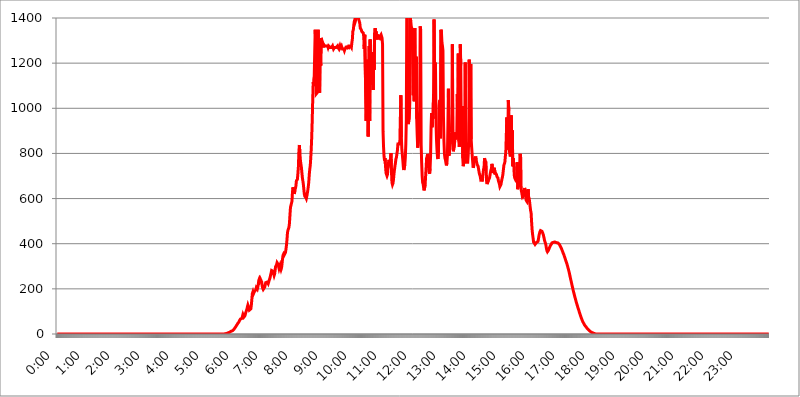
| Category | 2015.03.16. Intenzitás [W/m^2] |
|---|---|
| 0.0 | -0.256 |
| 0.0006944444444444445 | -0.256 |
| 0.001388888888888889 | -0.256 |
| 0.0020833333333333333 | -0.256 |
| 0.002777777777777778 | -0.256 |
| 0.003472222222222222 | -0.256 |
| 0.004166666666666667 | -0.256 |
| 0.004861111111111111 | -0.256 |
| 0.005555555555555556 | -0.256 |
| 0.0062499999999999995 | -0.256 |
| 0.006944444444444444 | -0.256 |
| 0.007638888888888889 | -0.256 |
| 0.008333333333333333 | -0.256 |
| 0.009027777777777779 | -0.256 |
| 0.009722222222222222 | -0.256 |
| 0.010416666666666666 | -0.256 |
| 0.011111111111111112 | -0.256 |
| 0.011805555555555555 | -0.256 |
| 0.012499999999999999 | -0.256 |
| 0.013194444444444444 | -0.256 |
| 0.013888888888888888 | -0.256 |
| 0.014583333333333332 | -0.256 |
| 0.015277777777777777 | -0.256 |
| 0.015972222222222224 | -0.256 |
| 0.016666666666666666 | -0.256 |
| 0.017361111111111112 | -0.256 |
| 0.018055555555555557 | -0.256 |
| 0.01875 | -0.256 |
| 0.019444444444444445 | -0.256 |
| 0.02013888888888889 | -0.256 |
| 0.020833333333333332 | -0.256 |
| 0.02152777777777778 | -0.256 |
| 0.022222222222222223 | -0.256 |
| 0.02291666666666667 | -0.256 |
| 0.02361111111111111 | -0.256 |
| 0.024305555555555556 | -0.256 |
| 0.024999999999999998 | -0.256 |
| 0.025694444444444447 | -0.256 |
| 0.02638888888888889 | -0.256 |
| 0.027083333333333334 | -0.256 |
| 0.027777777777777776 | -0.256 |
| 0.02847222222222222 | -0.256 |
| 0.029166666666666664 | -0.256 |
| 0.029861111111111113 | -0.256 |
| 0.030555555555555555 | -0.256 |
| 0.03125 | -0.256 |
| 0.03194444444444445 | -0.256 |
| 0.03263888888888889 | -0.256 |
| 0.03333333333333333 | -0.256 |
| 0.034027777777777775 | -0.256 |
| 0.034722222222222224 | -0.256 |
| 0.035416666666666666 | -0.256 |
| 0.036111111111111115 | -0.256 |
| 0.03680555555555556 | -0.256 |
| 0.0375 | -0.256 |
| 0.03819444444444444 | -0.256 |
| 0.03888888888888889 | -0.256 |
| 0.03958333333333333 | -0.256 |
| 0.04027777777777778 | -0.256 |
| 0.04097222222222222 | -0.256 |
| 0.041666666666666664 | -0.256 |
| 0.042361111111111106 | -0.256 |
| 0.04305555555555556 | -0.256 |
| 0.043750000000000004 | -0.256 |
| 0.044444444444444446 | -0.256 |
| 0.04513888888888889 | -0.256 |
| 0.04583333333333334 | -0.256 |
| 0.04652777777777778 | -0.256 |
| 0.04722222222222222 | -0.256 |
| 0.04791666666666666 | -0.256 |
| 0.04861111111111111 | -0.256 |
| 0.049305555555555554 | -0.256 |
| 0.049999999999999996 | -0.256 |
| 0.05069444444444445 | -0.256 |
| 0.051388888888888894 | -0.256 |
| 0.052083333333333336 | -0.256 |
| 0.05277777777777778 | -0.256 |
| 0.05347222222222222 | -0.256 |
| 0.05416666666666667 | -0.256 |
| 0.05486111111111111 | -0.256 |
| 0.05555555555555555 | -0.256 |
| 0.05625 | -0.256 |
| 0.05694444444444444 | -0.256 |
| 0.057638888888888885 | -0.256 |
| 0.05833333333333333 | -0.256 |
| 0.05902777777777778 | -0.256 |
| 0.059722222222222225 | -0.256 |
| 0.06041666666666667 | -0.256 |
| 0.061111111111111116 | -0.256 |
| 0.06180555555555556 | -0.256 |
| 0.0625 | -0.256 |
| 0.06319444444444444 | -0.256 |
| 0.06388888888888888 | -0.256 |
| 0.06458333333333334 | -0.256 |
| 0.06527777777777778 | -0.256 |
| 0.06597222222222222 | -0.256 |
| 0.06666666666666667 | -0.256 |
| 0.06736111111111111 | -0.256 |
| 0.06805555555555555 | -0.256 |
| 0.06874999999999999 | -0.256 |
| 0.06944444444444443 | -0.256 |
| 0.07013888888888889 | -0.256 |
| 0.07083333333333333 | -0.256 |
| 0.07152777777777779 | -0.256 |
| 0.07222222222222223 | -0.256 |
| 0.07291666666666667 | -0.256 |
| 0.07361111111111111 | -0.256 |
| 0.07430555555555556 | -0.256 |
| 0.075 | -0.256 |
| 0.07569444444444444 | -0.256 |
| 0.0763888888888889 | -0.256 |
| 0.07708333333333334 | -0.256 |
| 0.07777777777777778 | -0.256 |
| 0.07847222222222222 | -0.256 |
| 0.07916666666666666 | -0.256 |
| 0.0798611111111111 | -0.256 |
| 0.08055555555555556 | -0.256 |
| 0.08125 | -0.256 |
| 0.08194444444444444 | -0.256 |
| 0.08263888888888889 | -0.256 |
| 0.08333333333333333 | -0.256 |
| 0.08402777777777777 | -0.256 |
| 0.08472222222222221 | -0.256 |
| 0.08541666666666665 | -0.256 |
| 0.08611111111111112 | -0.256 |
| 0.08680555555555557 | -0.256 |
| 0.08750000000000001 | -0.256 |
| 0.08819444444444445 | -0.256 |
| 0.08888888888888889 | -0.256 |
| 0.08958333333333333 | -0.256 |
| 0.09027777777777778 | -0.256 |
| 0.09097222222222222 | -0.256 |
| 0.09166666666666667 | -0.256 |
| 0.09236111111111112 | -0.256 |
| 0.09305555555555556 | -0.256 |
| 0.09375 | -0.256 |
| 0.09444444444444444 | -0.256 |
| 0.09513888888888888 | -0.256 |
| 0.09583333333333333 | -0.256 |
| 0.09652777777777777 | -0.256 |
| 0.09722222222222222 | -0.256 |
| 0.09791666666666667 | -0.256 |
| 0.09861111111111111 | -0.256 |
| 0.09930555555555555 | -0.256 |
| 0.09999999999999999 | -0.256 |
| 0.10069444444444443 | -0.256 |
| 0.1013888888888889 | -0.256 |
| 0.10208333333333335 | -0.256 |
| 0.10277777777777779 | -0.256 |
| 0.10347222222222223 | -0.256 |
| 0.10416666666666667 | -0.256 |
| 0.10486111111111111 | -0.256 |
| 0.10555555555555556 | -0.256 |
| 0.10625 | -0.256 |
| 0.10694444444444444 | -0.256 |
| 0.1076388888888889 | -0.256 |
| 0.10833333333333334 | -0.256 |
| 0.10902777777777778 | -0.256 |
| 0.10972222222222222 | -0.256 |
| 0.1111111111111111 | -0.256 |
| 0.11180555555555556 | -0.256 |
| 0.11180555555555556 | -0.256 |
| 0.1125 | -0.256 |
| 0.11319444444444444 | -0.256 |
| 0.11388888888888889 | -0.256 |
| 0.11458333333333333 | -0.256 |
| 0.11527777777777777 | -0.256 |
| 0.11597222222222221 | -0.256 |
| 0.11666666666666665 | -0.256 |
| 0.1173611111111111 | -0.256 |
| 0.11805555555555557 | -0.256 |
| 0.11944444444444445 | -0.256 |
| 0.12013888888888889 | -0.256 |
| 0.12083333333333333 | -0.256 |
| 0.12152777777777778 | -0.256 |
| 0.12222222222222223 | -0.256 |
| 0.12291666666666667 | -0.256 |
| 0.12291666666666667 | -0.256 |
| 0.12361111111111112 | -0.256 |
| 0.12430555555555556 | -0.256 |
| 0.125 | -0.256 |
| 0.12569444444444444 | -0.256 |
| 0.12638888888888888 | -0.256 |
| 0.12708333333333333 | -0.256 |
| 0.16875 | -0.256 |
| 0.12847222222222224 | -0.256 |
| 0.12916666666666668 | -0.256 |
| 0.12986111111111112 | -0.256 |
| 0.13055555555555556 | -0.256 |
| 0.13125 | -0.256 |
| 0.13194444444444445 | -0.256 |
| 0.1326388888888889 | -0.256 |
| 0.13333333333333333 | -0.256 |
| 0.13402777777777777 | -0.256 |
| 0.13402777777777777 | -0.256 |
| 0.13472222222222222 | -0.256 |
| 0.13541666666666666 | -0.256 |
| 0.1361111111111111 | -0.256 |
| 0.13749999999999998 | -0.256 |
| 0.13819444444444443 | -0.256 |
| 0.1388888888888889 | -0.256 |
| 0.13958333333333334 | -0.256 |
| 0.14027777777777778 | -0.256 |
| 0.14097222222222222 | -0.256 |
| 0.14166666666666666 | -0.256 |
| 0.1423611111111111 | -0.256 |
| 0.14305555555555557 | -0.256 |
| 0.14375000000000002 | -0.256 |
| 0.14444444444444446 | -0.256 |
| 0.1451388888888889 | -0.256 |
| 0.1451388888888889 | -0.256 |
| 0.14652777777777778 | -0.256 |
| 0.14722222222222223 | -0.256 |
| 0.14791666666666667 | -0.256 |
| 0.1486111111111111 | -0.256 |
| 0.14930555555555555 | -0.256 |
| 0.15 | -0.256 |
| 0.15069444444444444 | -0.256 |
| 0.15138888888888888 | -0.256 |
| 0.15208333333333332 | -0.256 |
| 0.15277777777777776 | -0.256 |
| 0.15347222222222223 | -0.256 |
| 0.15416666666666667 | -0.256 |
| 0.15486111111111112 | -0.256 |
| 0.15555555555555556 | -0.256 |
| 0.15625 | -0.256 |
| 0.15694444444444444 | -0.256 |
| 0.15763888888888888 | -0.256 |
| 0.15833333333333333 | -0.256 |
| 0.15902777777777777 | -0.256 |
| 0.15972222222222224 | -0.256 |
| 0.16041666666666668 | -0.256 |
| 0.16111111111111112 | -0.256 |
| 0.16180555555555556 | -0.256 |
| 0.1625 | -0.256 |
| 0.16319444444444445 | -0.256 |
| 0.1638888888888889 | -0.256 |
| 0.16458333333333333 | -0.256 |
| 0.16527777777777777 | -0.256 |
| 0.16597222222222222 | -0.256 |
| 0.16666666666666666 | -0.256 |
| 0.1673611111111111 | -0.256 |
| 0.16805555555555554 | -0.256 |
| 0.16874999999999998 | -0.256 |
| 0.16944444444444443 | -0.256 |
| 0.17013888888888887 | -0.256 |
| 0.1708333333333333 | -0.256 |
| 0.17152777777777775 | -0.256 |
| 0.17222222222222225 | -0.256 |
| 0.1729166666666667 | -0.256 |
| 0.17361111111111113 | -0.256 |
| 0.17430555555555557 | -0.256 |
| 0.17500000000000002 | -0.256 |
| 0.17569444444444446 | -0.256 |
| 0.1763888888888889 | -0.256 |
| 0.17708333333333334 | -0.256 |
| 0.17777777777777778 | -0.256 |
| 0.17847222222222223 | -0.256 |
| 0.17916666666666667 | -0.256 |
| 0.1798611111111111 | -0.256 |
| 0.18055555555555555 | -0.256 |
| 0.18125 | -0.256 |
| 0.18194444444444444 | -0.256 |
| 0.1826388888888889 | -0.256 |
| 0.18333333333333335 | -0.256 |
| 0.1840277777777778 | -0.256 |
| 0.18472222222222223 | -0.256 |
| 0.18541666666666667 | -0.256 |
| 0.18611111111111112 | -0.256 |
| 0.18680555555555556 | -0.256 |
| 0.1875 | -0.256 |
| 0.18819444444444444 | -0.256 |
| 0.18888888888888888 | -0.256 |
| 0.18958333333333333 | -0.256 |
| 0.19027777777777777 | -0.256 |
| 0.1909722222222222 | -0.256 |
| 0.19166666666666665 | -0.256 |
| 0.19236111111111112 | -0.256 |
| 0.19305555555555554 | -0.256 |
| 0.19375 | -0.256 |
| 0.19444444444444445 | -0.256 |
| 0.1951388888888889 | -0.256 |
| 0.19583333333333333 | -0.256 |
| 0.19652777777777777 | -0.256 |
| 0.19722222222222222 | -0.256 |
| 0.19791666666666666 | -0.256 |
| 0.1986111111111111 | -0.256 |
| 0.19930555555555554 | -0.256 |
| 0.19999999999999998 | -0.256 |
| 0.20069444444444443 | -0.256 |
| 0.20138888888888887 | -0.256 |
| 0.2020833333333333 | -0.256 |
| 0.2027777777777778 | -0.256 |
| 0.2034722222222222 | -0.256 |
| 0.2041666666666667 | -0.256 |
| 0.20486111111111113 | -0.256 |
| 0.20555555555555557 | -0.256 |
| 0.20625000000000002 | -0.256 |
| 0.20694444444444446 | -0.256 |
| 0.2076388888888889 | -0.256 |
| 0.20833333333333334 | -0.256 |
| 0.20902777777777778 | -0.256 |
| 0.20972222222222223 | -0.256 |
| 0.21041666666666667 | -0.256 |
| 0.2111111111111111 | -0.256 |
| 0.21180555555555555 | -0.256 |
| 0.2125 | -0.256 |
| 0.21319444444444444 | -0.256 |
| 0.2138888888888889 | -0.256 |
| 0.21458333333333335 | -0.256 |
| 0.2152777777777778 | -0.256 |
| 0.21597222222222223 | -0.256 |
| 0.21666666666666667 | -0.256 |
| 0.21736111111111112 | -0.256 |
| 0.21805555555555556 | -0.256 |
| 0.21875 | -0.256 |
| 0.21944444444444444 | -0.256 |
| 0.22013888888888888 | -0.256 |
| 0.22083333333333333 | -0.256 |
| 0.22152777777777777 | -0.256 |
| 0.2222222222222222 | -0.256 |
| 0.22291666666666665 | -0.256 |
| 0.2236111111111111 | -0.256 |
| 0.22430555555555556 | -0.256 |
| 0.225 | -0.256 |
| 0.22569444444444445 | -0.256 |
| 0.2263888888888889 | -0.256 |
| 0.22708333333333333 | -0.256 |
| 0.22777777777777777 | -0.256 |
| 0.22847222222222222 | -0.256 |
| 0.22916666666666666 | -0.256 |
| 0.2298611111111111 | -0.256 |
| 0.23055555555555554 | -0.256 |
| 0.23124999999999998 | -0.256 |
| 0.23194444444444443 | -0.256 |
| 0.23263888888888887 | -0.256 |
| 0.2333333333333333 | -0.256 |
| 0.2340277777777778 | -0.256 |
| 0.2347222222222222 | 1.09 |
| 0.2354166666666667 | 1.09 |
| 0.23611111111111113 | 1.09 |
| 0.23680555555555557 | 2.439 |
| 0.23750000000000002 | 2.439 |
| 0.23819444444444446 | 3.791 |
| 0.2388888888888889 | 3.791 |
| 0.23958333333333334 | 5.146 |
| 0.24027777777777778 | 6.503 |
| 0.24097222222222223 | 7.862 |
| 0.24166666666666667 | 7.862 |
| 0.2423611111111111 | 9.225 |
| 0.24305555555555555 | 10.589 |
| 0.24375 | 11.956 |
| 0.24444444444444446 | 11.956 |
| 0.24513888888888888 | 13.325 |
| 0.24583333333333335 | 14.696 |
| 0.2465277777777778 | 17.444 |
| 0.24722222222222223 | 18.822 |
| 0.24791666666666667 | 21.582 |
| 0.24861111111111112 | 24.35 |
| 0.24930555555555556 | 27.124 |
| 0.25 | 29.905 |
| 0.25069444444444444 | 34.086 |
| 0.2513888888888889 | 38.28 |
| 0.2520833333333333 | 41.081 |
| 0.25277777777777777 | 45.29 |
| 0.2534722222222222 | 48.1 |
| 0.25416666666666665 | 49.507 |
| 0.2548611111111111 | 53.73 |
| 0.2555555555555556 | 59.368 |
| 0.25625000000000003 | 63.6 |
| 0.2569444444444445 | 66.423 |
| 0.2576388888888889 | 66.423 |
| 0.25833333333333336 | 65.012 |
| 0.2590277777777778 | 69.246 |
| 0.25972222222222224 | 77.715 |
| 0.2604166666666667 | 86.175 |
| 0.2611111111111111 | 83.356 |
| 0.26180555555555557 | 74.892 |
| 0.2625 | 74.892 |
| 0.26319444444444445 | 80.536 |
| 0.2638888888888889 | 88.991 |
| 0.26458333333333334 | 97.427 |
| 0.2652777777777778 | 103.035 |
| 0.2659722222222222 | 110.025 |
| 0.26666666666666666 | 119.766 |
| 0.2673611111111111 | 128.065 |
| 0.26805555555555555 | 125.304 |
| 0.26875 | 114.207 |
| 0.26944444444444443 | 105.834 |
| 0.2701388888888889 | 101.634 |
| 0.2708333333333333 | 104.435 |
| 0.27152777777777776 | 111.42 |
| 0.2722222222222222 | 128.065 |
| 0.27291666666666664 | 152.637 |
| 0.2736111111111111 | 179.258 |
| 0.2743055555555555 | 185.79 |
| 0.27499999999999997 | 176.631 |
| 0.27569444444444446 | 175.315 |
| 0.27638888888888885 | 187.091 |
| 0.27708333333333335 | 187.091 |
| 0.2777777777777778 | 185.79 |
| 0.27847222222222223 | 196.135 |
| 0.2791666666666667 | 205.079 |
| 0.2798611111111111 | 201.258 |
| 0.28055555555555556 | 198.701 |
| 0.28125 | 207.615 |
| 0.28194444444444444 | 220.177 |
| 0.2826388888888889 | 237.433 |
| 0.2833333333333333 | 243.507 |
| 0.28402777777777777 | 237.433 |
| 0.2847222222222222 | 244.717 |
| 0.28541666666666665 | 248.335 |
| 0.28611111111111115 | 243.507 |
| 0.28680555555555554 | 230.083 |
| 0.28750000000000003 | 211.405 |
| 0.2881944444444445 | 202.534 |
| 0.2888888888888889 | 197.419 |
| 0.28958333333333336 | 193.561 |
| 0.2902777777777778 | 196.135 |
| 0.29097222222222224 | 207.615 |
| 0.2916666666666667 | 217.681 |
| 0.2923611111111111 | 227.618 |
| 0.29305555555555557 | 230.083 |
| 0.29375 | 230.083 |
| 0.29444444444444445 | 230.083 |
| 0.2951388888888889 | 226.383 |
| 0.29583333333333334 | 222.665 |
| 0.2965277777777778 | 230.083 |
| 0.2972222222222222 | 237.433 |
| 0.29791666666666666 | 243.507 |
| 0.2986111111111111 | 251.939 |
| 0.29930555555555555 | 262.666 |
| 0.3 | 270.931 |
| 0.30069444444444443 | 281.471 |
| 0.3013888888888889 | 284.967 |
| 0.3020833333333333 | 281.471 |
| 0.30277777777777776 | 277.967 |
| 0.3034722222222222 | 267.396 |
| 0.30416666666666664 | 259.104 |
| 0.3048611111111111 | 266.216 |
| 0.3055555555555555 | 282.637 |
| 0.30624999999999997 | 298.885 |
| 0.3069444444444444 | 301.198 |
| 0.3076388888888889 | 306.974 |
| 0.30833333333333335 | 316.215 |
| 0.3090277777777778 | 316.215 |
| 0.30972222222222223 | 309.284 |
| 0.3104166666666667 | 305.819 |
| 0.3111111111111111 | 289.616 |
| 0.31180555555555556 | 289.616 |
| 0.3125 | 303.509 |
| 0.31319444444444444 | 294.255 |
| 0.3138888888888889 | 286.13 |
| 0.3145833333333333 | 293.096 |
| 0.31527777777777777 | 311.594 |
| 0.3159722222222222 | 332.443 |
| 0.31666666666666665 | 348.865 |
| 0.31736111111111115 | 353.613 |
| 0.31805555555555554 | 348.865 |
| 0.31875000000000003 | 347.682 |
| 0.3194444444444445 | 352.423 |
| 0.3201388888888889 | 362.004 |
| 0.32083333333333336 | 376.682 |
| 0.3215277777777778 | 394.415 |
| 0.32222222222222224 | 418.495 |
| 0.3229166666666667 | 449.011 |
| 0.3236111111111111 | 459.898 |
| 0.32430555555555557 | 459.898 |
| 0.325 | 472.848 |
| 0.32569444444444445 | 491.63 |
| 0.3263888888888889 | 527.122 |
| 0.32708333333333334 | 560.495 |
| 0.3277777777777778 | 562.699 |
| 0.3284722222222222 | 560.495 |
| 0.32916666666666666 | 587.934 |
| 0.3298611111111111 | 625.508 |
| 0.33055555555555555 | 649.973 |
| 0.33125 | 649.973 |
| 0.33194444444444443 | 633.495 |
| 0.3326388888888889 | 620.273 |
| 0.3333333333333333 | 638.912 |
| 0.3340277777777778 | 644.405 |
| 0.3347222222222222 | 655.618 |
| 0.3354166666666667 | 678.997 |
| 0.3361111111111111 | 676.003 |
| 0.3368055555555556 | 685.046 |
| 0.33749999999999997 | 710.098 |
| 0.33819444444444446 | 739.988 |
| 0.33888888888888885 | 805.632 |
| 0.33958333333333335 | 837.51 |
| 0.34027777777777773 | 801.768 |
| 0.34097222222222223 | 771.794 |
| 0.3416666666666666 | 753.881 |
| 0.3423611111111111 | 739.988 |
| 0.3430555555555555 | 716.58 |
| 0.34375 | 694.278 |
| 0.3444444444444445 | 678.997 |
| 0.3451388888888889 | 664.234 |
| 0.3458333333333334 | 641.649 |
| 0.34652777777777777 | 620.273 |
| 0.34722222222222227 | 610.016 |
| 0.34791666666666665 | 610.016 |
| 0.34861111111111115 | 604.992 |
| 0.34930555555555554 | 600.035 |
| 0.35000000000000003 | 610.016 |
| 0.3506944444444444 | 622.881 |
| 0.3513888888888889 | 636.194 |
| 0.3520833333333333 | 652.786 |
| 0.3527777777777778 | 673.03 |
| 0.3534722222222222 | 706.89 |
| 0.3541666666666667 | 729.817 |
| 0.3548611111111111 | 746.886 |
| 0.35555555555555557 | 779.134 |
| 0.35625 | 821.353 |
| 0.35694444444444445 | 875.511 |
| 0.3576388888888889 | 949.03 |
| 0.35833333333333334 | 1041.644 |
| 0.3590277777777778 | 1115.634 |
| 0.3597222222222222 | 1098.004 |
| 0.36041666666666666 | 1139.675 |
| 0.3611111111111111 | 1248.934 |
| 0.36180555555555555 | 1348.039 |
| 0.3625 | 1290.36 |
| 0.36319444444444443 | 1063.751 |
| 0.3638888888888889 | 1063.751 |
| 0.3645833333333333 | 1069.368 |
| 0.3652777777777778 | 1098.004 |
| 0.3659722222222222 | 1348.039 |
| 0.3666666666666667 | 1069.368 |
| 0.3673611111111111 | 1075.021 |
| 0.3680555555555556 | 1069.368 |
| 0.36874999999999997 | 1304.515 |
| 0.36944444444444446 | 1189.633 |
| 0.37013888888888885 | 1311.658 |
| 0.37083333333333335 | 1304.515 |
| 0.37152777777777773 | 1297.416 |
| 0.37222222222222223 | 1276.38 |
| 0.3729166666666666 | 1269.454 |
| 0.3736111111111111 | 1283.348 |
| 0.3743055555555555 | 1283.348 |
| 0.375 | 1276.38 |
| 0.3756944444444445 | 1276.38 |
| 0.3763888888888889 | 1276.38 |
| 0.3770833333333334 | 1276.38 |
| 0.37777777777777777 | 1276.38 |
| 0.37847222222222227 | 1276.38 |
| 0.37916666666666665 | 1276.38 |
| 0.37986111111111115 | 1269.454 |
| 0.38055555555555554 | 1276.38 |
| 0.38125000000000003 | 1276.38 |
| 0.3819444444444444 | 1276.38 |
| 0.3826388888888889 | 1269.454 |
| 0.3833333333333333 | 1269.454 |
| 0.3840277777777778 | 1269.454 |
| 0.3847222222222222 | 1269.454 |
| 0.3854166666666667 | 1269.454 |
| 0.3861111111111111 | 1276.38 |
| 0.38680555555555557 | 1269.454 |
| 0.3875 | 1262.571 |
| 0.38819444444444445 | 1262.571 |
| 0.3888888888888889 | 1269.454 |
| 0.38958333333333334 | 1269.454 |
| 0.3902777777777778 | 1269.454 |
| 0.3909722222222222 | 1269.454 |
| 0.39166666666666666 | 1269.454 |
| 0.3923611111111111 | 1269.454 |
| 0.39305555555555555 | 1276.38 |
| 0.39375 | 1269.454 |
| 0.39444444444444443 | 1269.454 |
| 0.3951388888888889 | 1262.571 |
| 0.3958333333333333 | 1262.571 |
| 0.3965277777777778 | 1276.38 |
| 0.3972222222222222 | 1269.454 |
| 0.3979166666666667 | 1269.454 |
| 0.3986111111111111 | 1276.38 |
| 0.3993055555555556 | 1269.454 |
| 0.39999999999999997 | 1262.571 |
| 0.40069444444444446 | 1262.571 |
| 0.40138888888888885 | 1262.571 |
| 0.40208333333333335 | 1262.571 |
| 0.40277777777777773 | 1255.731 |
| 0.40347222222222223 | 1262.571 |
| 0.4041666666666666 | 1262.571 |
| 0.4048611111111111 | 1269.454 |
| 0.4055555555555555 | 1276.38 |
| 0.40625 | 1262.571 |
| 0.4069444444444445 | 1276.38 |
| 0.4076388888888889 | 1276.38 |
| 0.4083333333333334 | 1262.571 |
| 0.40902777777777777 | 1276.38 |
| 0.40972222222222227 | 1276.38 |
| 0.41041666666666665 | 1276.38 |
| 0.41111111111111115 | 1276.38 |
| 0.41180555555555554 | 1276.38 |
| 0.41250000000000003 | 1269.454 |
| 0.4131944444444444 | 1290.36 |
| 0.4138888888888889 | 1304.515 |
| 0.4145833333333333 | 1340.673 |
| 0.4152777777777778 | 1348.039 |
| 0.4159722222222222 | 1370.408 |
| 0.4166666666666667 | 1385.549 |
| 0.4173611111111111 | 1393.189 |
| 0.41805555555555557 | 1385.549 |
| 0.41875 | 1393.189 |
| 0.41944444444444445 | 1408.609 |
| 0.4201388888888889 | 1408.609 |
| 0.42083333333333334 | 1424.216 |
| 0.4215277777777778 | 1408.609 |
| 0.4222222222222222 | 1408.609 |
| 0.42291666666666666 | 1408.609 |
| 0.4236111111111111 | 1385.549 |
| 0.42430555555555555 | 1377.956 |
| 0.425 | 1355.45 |
| 0.42569444444444443 | 1355.45 |
| 0.4263888888888889 | 1348.039 |
| 0.4270833333333333 | 1340.673 |
| 0.4277777777777778 | 1340.673 |
| 0.4284722222222222 | 1340.673 |
| 0.4291666666666667 | 1333.352 |
| 0.4298611111111111 | 1318.845 |
| 0.4305555555555556 | 1262.571 |
| 0.43124999999999997 | 1326.076 |
| 0.43194444444444446 | 1326.076 |
| 0.43263888888888885 | 1326.076 |
| 0.43333333333333335 | 944.201 |
| 0.43402777777777773 | 1030.804 |
| 0.43472222222222223 | 1080.711 |
| 0.4354166666666666 | 1215.576 |
| 0.4361111111111111 | 875.511 |
| 0.4368055555555555 | 1041.644 |
| 0.4375 | 1276.38 |
| 0.4381944444444445 | 944.201 |
| 0.4388888888888889 | 1304.515 |
| 0.4395833333333334 | 1103.843 |
| 0.44027777777777777 | 1235.465 |
| 0.44097222222222227 | 1202.523 |
| 0.44166666666666665 | 1109.72 |
| 0.44236111111111115 | 1248.934 |
| 0.44305555555555554 | 1080.711 |
| 0.44375000000000003 | 1215.576 |
| 0.4444444444444444 | 1170.601 |
| 0.4451388888888889 | 1333.352 |
| 0.4458333333333333 | 1355.45 |
| 0.4465277777777778 | 1333.352 |
| 0.4472222222222222 | 1340.673 |
| 0.4479166666666667 | 1318.845 |
| 0.4486111111111111 | 1304.515 |
| 0.44930555555555557 | 1326.076 |
| 0.45 | 1318.845 |
| 0.45069444444444445 | 1318.845 |
| 0.4513888888888889 | 1318.845 |
| 0.45208333333333334 | 1311.658 |
| 0.4527777777777778 | 1318.845 |
| 0.4534722222222222 | 1318.845 |
| 0.45416666666666666 | 1326.076 |
| 0.4548611111111111 | 1326.076 |
| 0.45555555555555555 | 1311.658 |
| 0.45625 | 1283.348 |
| 0.45694444444444443 | 897.643 |
| 0.4576388888888889 | 829.377 |
| 0.4583333333333333 | 786.575 |
| 0.4590277777777778 | 768.162 |
| 0.4597222222222222 | 779.134 |
| 0.4604166666666667 | 743.425 |
| 0.4611111111111111 | 713.328 |
| 0.4618055555555556 | 706.89 |
| 0.46249999999999997 | 700.54 |
| 0.46319444444444446 | 706.89 |
| 0.46388888888888885 | 736.574 |
| 0.46458333333333335 | 757.414 |
| 0.46527777777777773 | 771.794 |
| 0.46597222222222223 | 757.414 |
| 0.4666666666666666 | 753.881 |
| 0.4673611111111111 | 768.162 |
| 0.4680555555555555 | 801.768 |
| 0.46875 | 719.855 |
| 0.4694444444444445 | 670.078 |
| 0.4701388888888889 | 661.343 |
| 0.4708333333333334 | 667.146 |
| 0.47152777777777777 | 682.011 |
| 0.47222222222222227 | 706.89 |
| 0.47291666666666665 | 726.474 |
| 0.47361111111111115 | 743.425 |
| 0.47430555555555554 | 757.414 |
| 0.47500000000000003 | 775.451 |
| 0.4756944444444444 | 782.842 |
| 0.4763888888888889 | 797.931 |
| 0.4770833333333333 | 813.439 |
| 0.4777777777777778 | 841.619 |
| 0.4784722222222222 | 845.755 |
| 0.4791666666666667 | 845.755 |
| 0.4798611111111111 | 841.619 |
| 0.48055555555555557 | 858.335 |
| 0.48125 | 963.712 |
| 0.48194444444444445 | 1058.17 |
| 0.4826388888888889 | 871.173 |
| 0.48333333333333334 | 817.382 |
| 0.4840277777777778 | 794.119 |
| 0.4847222222222222 | 768.162 |
| 0.48541666666666666 | 739.988 |
| 0.4861111111111111 | 726.474 |
| 0.48680555555555555 | 729.817 |
| 0.4875 | 750.371 |
| 0.48819444444444443 | 782.842 |
| 0.4888888888888889 | 841.619 |
| 0.4895833333333333 | 949.03 |
| 0.4902777777777778 | 1447.982 |
| 0.4909722222222222 | 1424.216 |
| 0.4916666666666667 | 963.712 |
| 0.4923611111111111 | 929.905 |
| 0.4930555555555556 | 944.201 |
| 0.49374999999999997 | 953.892 |
| 0.49444444444444446 | 1025.437 |
| 0.49513888888888885 | 1400.876 |
| 0.49583333333333335 | 1385.549 |
| 0.49652777777777773 | 1362.906 |
| 0.49722222222222223 | 1355.45 |
| 0.4979166666666666 | 1340.673 |
| 0.4986111111111111 | 1183.249 |
| 0.4993055555555555 | 1058.17 |
| 0.5 | 1290.36 |
| 0.5006944444444444 | 1030.804 |
| 0.5013888888888889 | 1355.45 |
| 0.5020833333333333 | 1151.928 |
| 0.5027777777777778 | 1086.439 |
| 0.5034722222222222 | 1228.794 |
| 0.5041666666666667 | 953.892 |
| 0.5048611111111111 | 879.878 |
| 0.5055555555555555 | 825.351 |
| 0.50625 | 829.377 |
| 0.5069444444444444 | 871.173 |
| 0.5076388888888889 | 944.201 |
| 0.5083333333333333 | 993.965 |
| 0.5090277777777777 | 1362.906 |
| 0.5097222222222222 | 1348.039 |
| 0.5104166666666666 | 837.51 |
| 0.5111111111111112 | 757.414 |
| 0.5118055555555555 | 700.54 |
| 0.5125000000000001 | 670.078 |
| 0.5131944444444444 | 664.234 |
| 0.513888888888889 | 647.179 |
| 0.5145833333333333 | 636.194 |
| 0.5152777777777778 | 638.912 |
| 0.5159722222222222 | 661.343 |
| 0.5166666666666667 | 700.54 |
| 0.517361111111111 | 736.574 |
| 0.5180555555555556 | 779.134 |
| 0.5187499999999999 | 786.575 |
| 0.5194444444444445 | 797.931 |
| 0.5201388888888888 | 771.794 |
| 0.5208333333333334 | 736.574 |
| 0.5215277777777778 | 716.58 |
| 0.5222222222222223 | 710.098 |
| 0.5229166666666667 | 733.184 |
| 0.5236111111111111 | 790.334 |
| 0.5243055555555556 | 915.893 |
| 0.525 | 978.688 |
| 0.5256944444444445 | 915.893 |
| 0.5263888888888889 | 968.671 |
| 0.5270833333333333 | 953.892 |
| 0.5277777777777778 | 1063.751 |
| 0.5284722222222222 | 1393.189 |
| 0.5291666666666667 | 1145.782 |
| 0.5298611111111111 | 1202.523 |
| 0.5305555555555556 | 1164.337 |
| 0.53125 | 934.639 |
| 0.5319444444444444 | 858.335 |
| 0.5326388888888889 | 813.439 |
| 0.5333333333333333 | 782.842 |
| 0.5340277777777778 | 775.451 |
| 0.5347222222222222 | 817.382 |
| 0.5354166666666667 | 1009.546 |
| 0.5361111111111111 | 1030.804 |
| 0.5368055555555555 | 1036.206 |
| 0.5375 | 866.865 |
| 0.5381944444444444 | 1348.039 |
| 0.5388888888888889 | 1333.352 |
| 0.5395833333333333 | 1290.36 |
| 0.5402777777777777 | 1276.38 |
| 0.5409722222222222 | 1255.731 |
| 0.5416666666666666 | 963.712 |
| 0.5423611111111112 | 854.113 |
| 0.5430555555555555 | 797.931 |
| 0.5437500000000001 | 779.134 |
| 0.5444444444444444 | 771.794 |
| 0.545138888888889 | 757.414 |
| 0.5458333333333333 | 746.886 |
| 0.5465277777777778 | 757.414 |
| 0.5472222222222222 | 790.334 |
| 0.5479166666666667 | 925.203 |
| 0.548611111111111 | 1086.439 |
| 0.5493055555555556 | 790.334 |
| 0.5499999999999999 | 794.119 |
| 0.5506944444444445 | 825.351 |
| 0.5513888888888888 | 849.92 |
| 0.5520833333333334 | 858.335 |
| 0.5527777777777778 | 893.157 |
| 0.5534722222222223 | 973.663 |
| 0.5541666666666667 | 1283.348 |
| 0.5548611111111111 | 841.619 |
| 0.5555555555555556 | 809.522 |
| 0.55625 | 813.439 |
| 0.5569444444444445 | 837.51 |
| 0.5576388888888889 | 858.335 |
| 0.5583333333333333 | 893.157 |
| 0.5590277777777778 | 862.585 |
| 0.5597222222222222 | 858.335 |
| 0.5604166666666667 | 893.157 |
| 0.5611111111111111 | 1063.751 |
| 0.5618055555555556 | 893.157 |
| 0.5625 | 1242.179 |
| 0.5631944444444444 | 854.113 |
| 0.5638888888888889 | 829.377 |
| 0.5645833333333333 | 862.585 |
| 0.5652777777777778 | 1283.348 |
| 0.5659722222222222 | 1189.633 |
| 0.5666666666666667 | 897.643 |
| 0.5673611111111111 | 893.157 |
| 0.5680555555555555 | 1009.546 |
| 0.56875 | 779.134 |
| 0.5694444444444444 | 743.425 |
| 0.5701388888888889 | 760.972 |
| 0.5708333333333333 | 821.353 |
| 0.5715277777777777 | 866.865 |
| 0.5722222222222222 | 1202.523 |
| 0.5729166666666666 | 775.451 |
| 0.5736111111111112 | 760.972 |
| 0.5743055555555555 | 764.555 |
| 0.5750000000000001 | 760.972 |
| 0.5756944444444444 | 760.972 |
| 0.576388888888889 | 794.119 |
| 0.5770833333333333 | 854.113 |
| 0.5777777777777778 | 1215.576 |
| 0.5784722222222222 | 993.965 |
| 0.5791666666666667 | 829.377 |
| 0.579861111111111 | 1196.058 |
| 0.5805555555555556 | 862.585 |
| 0.5812499999999999 | 825.351 |
| 0.5819444444444445 | 794.119 |
| 0.5826388888888888 | 764.555 |
| 0.5833333333333334 | 736.574 |
| 0.5840277777777778 | 743.425 |
| 0.5847222222222223 | 779.134 |
| 0.5854166666666667 | 771.794 |
| 0.5861111111111111 | 768.162 |
| 0.5868055555555556 | 786.575 |
| 0.5875 | 771.794 |
| 0.5881944444444445 | 760.972 |
| 0.5888888888888889 | 750.371 |
| 0.5895833333333333 | 746.886 |
| 0.5902777777777778 | 743.425 |
| 0.5909722222222222 | 729.817 |
| 0.5916666666666667 | 716.58 |
| 0.5923611111111111 | 706.89 |
| 0.5930555555555556 | 700.54 |
| 0.59375 | 688.102 |
| 0.5944444444444444 | 688.102 |
| 0.5951388888888889 | 694.278 |
| 0.5958333333333333 | 676.003 |
| 0.5965277777777778 | 688.102 |
| 0.5972222222222222 | 710.098 |
| 0.5979166666666667 | 729.817 |
| 0.5986111111111111 | 739.988 |
| 0.5993055555555555 | 779.134 |
| 0.6 | 768.162 |
| 0.6006944444444444 | 771.794 |
| 0.6013888888888889 | 760.972 |
| 0.6020833333333333 | 678.997 |
| 0.6027777777777777 | 664.234 |
| 0.6034722222222222 | 661.343 |
| 0.6041666666666666 | 667.146 |
| 0.6048611111111112 | 682.011 |
| 0.6055555555555555 | 685.046 |
| 0.6062500000000001 | 691.18 |
| 0.6069444444444444 | 703.704 |
| 0.607638888888889 | 716.58 |
| 0.6083333333333333 | 726.474 |
| 0.6090277777777778 | 733.184 |
| 0.6097222222222222 | 753.881 |
| 0.6104166666666667 | 733.184 |
| 0.611111111111111 | 723.153 |
| 0.6118055555555556 | 713.328 |
| 0.6124999999999999 | 713.328 |
| 0.6131944444444445 | 736.574 |
| 0.6138888888888888 | 706.89 |
| 0.6145833333333334 | 713.328 |
| 0.6152777777777778 | 713.328 |
| 0.6159722222222223 | 706.89 |
| 0.6166666666666667 | 697.399 |
| 0.6173611111111111 | 697.399 |
| 0.6180555555555556 | 691.18 |
| 0.61875 | 678.997 |
| 0.6194444444444445 | 676.003 |
| 0.6201388888888889 | 664.234 |
| 0.6208333333333333 | 652.786 |
| 0.6215277777777778 | 655.618 |
| 0.6222222222222222 | 661.343 |
| 0.6229166666666667 | 673.03 |
| 0.6236111111111111 | 685.046 |
| 0.6243055555555556 | 694.278 |
| 0.625 | 706.89 |
| 0.6256944444444444 | 726.474 |
| 0.6263888888888889 | 746.886 |
| 0.6270833333333333 | 753.881 |
| 0.6277777777777778 | 760.972 |
| 0.6284722222222222 | 786.575 |
| 0.6291666666666667 | 809.522 |
| 0.6298611111111111 | 813.439 |
| 0.6305555555555555 | 958.785 |
| 0.63125 | 817.382 |
| 0.6319444444444444 | 854.113 |
| 0.6326388888888889 | 1036.206 |
| 0.6333333333333333 | 988.839 |
| 0.6340277777777777 | 813.439 |
| 0.6347222222222222 | 797.931 |
| 0.6354166666666666 | 786.575 |
| 0.6361111111111112 | 797.931 |
| 0.6368055555555555 | 968.671 |
| 0.6375000000000001 | 845.755 |
| 0.6381944444444444 | 902.16 |
| 0.638888888888889 | 743.425 |
| 0.6395833333333333 | 779.134 |
| 0.6402777777777778 | 750.371 |
| 0.6409722222222222 | 703.704 |
| 0.6416666666666667 | 691.18 |
| 0.642361111111111 | 688.102 |
| 0.6430555555555556 | 682.011 |
| 0.6437499999999999 | 685.046 |
| 0.6444444444444445 | 673.03 |
| 0.6451388888888888 | 760.972 |
| 0.6458333333333334 | 641.649 |
| 0.6465277777777778 | 658.471 |
| 0.6472222222222223 | 673.03 |
| 0.6479166666666667 | 667.146 |
| 0.6486111111111111 | 652.786 |
| 0.6493055555555556 | 797.931 |
| 0.65 | 779.134 |
| 0.6506944444444445 | 636.194 |
| 0.6513888888888889 | 628.152 |
| 0.6520833333333333 | 615.11 |
| 0.6527777777777778 | 620.273 |
| 0.6534722222222222 | 612.554 |
| 0.6541666666666667 | 612.554 |
| 0.6548611111111111 | 622.881 |
| 0.6555555555555556 | 647.179 |
| 0.65625 | 625.508 |
| 0.6569444444444444 | 607.495 |
| 0.6576388888888889 | 592.725 |
| 0.6583333333333333 | 592.725 |
| 0.6590277777777778 | 585.562 |
| 0.6597222222222222 | 592.725 |
| 0.6604166666666667 | 641.649 |
| 0.6611111111111111 | 607.495 |
| 0.6618055555555555 | 602.505 |
| 0.6625 | 585.562 |
| 0.6631944444444444 | 564.917 |
| 0.6638888888888889 | 547.572 |
| 0.6645833333333333 | 537.182 |
| 0.6652777777777777 | 496.965 |
| 0.6659722222222222 | 463.083 |
| 0.6666666666666666 | 441.469 |
| 0.6673611111111111 | 425.497 |
| 0.6680555555555556 | 407.589 |
| 0.6687500000000001 | 406.25 |
| 0.6694444444444444 | 406.25 |
| 0.6701388888888888 | 397.012 |
| 0.6708333333333334 | 395.711 |
| 0.6715277777777778 | 394.415 |
| 0.6722222222222222 | 406.25 |
| 0.6729166666666666 | 404.916 |
| 0.6736111111111112 | 404.916 |
| 0.6743055555555556 | 410.283 |
| 0.6749999999999999 | 422.678 |
| 0.6756944444444444 | 437.031 |
| 0.6763888888888889 | 445.971 |
| 0.6770833333333334 | 453.629 |
| 0.6777777777777777 | 458.318 |
| 0.6784722222222223 | 458.318 |
| 0.6791666666666667 | 456.747 |
| 0.6798611111111111 | 455.184 |
| 0.6805555555555555 | 452.082 |
| 0.68125 | 444.463 |
| 0.6819444444444445 | 437.031 |
| 0.6826388888888889 | 426.916 |
| 0.6833333333333332 | 415.735 |
| 0.6840277777777778 | 408.934 |
| 0.6847222222222222 | 402.262 |
| 0.6854166666666667 | 393.122 |
| 0.686111111111111 | 377.925 |
| 0.6868055555555556 | 369.291 |
| 0.6875 | 364.422 |
| 0.6881944444444444 | 366.851 |
| 0.688888888888889 | 370.515 |
| 0.6895833333333333 | 376.682 |
| 0.6902777777777778 | 381.674 |
| 0.6909722222222222 | 386.723 |
| 0.6916666666666668 | 391.834 |
| 0.6923611111111111 | 395.711 |
| 0.6930555555555555 | 398.318 |
| 0.69375 | 403.587 |
| 0.6944444444444445 | 406.25 |
| 0.6951388888888889 | 406.25 |
| 0.6958333333333333 | 406.25 |
| 0.6965277777777777 | 407.589 |
| 0.6972222222222223 | 408.934 |
| 0.6979166666666666 | 407.589 |
| 0.6986111111111111 | 407.589 |
| 0.6993055555555556 | 406.25 |
| 0.7000000000000001 | 404.916 |
| 0.7006944444444444 | 404.916 |
| 0.7013888888888888 | 403.587 |
| 0.7020833333333334 | 403.587 |
| 0.7027777777777778 | 402.262 |
| 0.7034722222222222 | 399.628 |
| 0.7041666666666666 | 397.012 |
| 0.7048611111111112 | 393.122 |
| 0.7055555555555556 | 389.27 |
| 0.7062499999999999 | 385.455 |
| 0.7069444444444444 | 380.42 |
| 0.7076388888888889 | 374.206 |
| 0.7083333333333334 | 369.291 |
| 0.7090277777777777 | 363.212 |
| 0.7097222222222223 | 357.196 |
| 0.7104166666666667 | 352.423 |
| 0.7111111111111111 | 345.322 |
| 0.7118055555555555 | 339.449 |
| 0.7125 | 332.443 |
| 0.7131944444444445 | 325.473 |
| 0.7138888888888889 | 319.683 |
| 0.7145833333333332 | 312.749 |
| 0.7152777777777778 | 305.819 |
| 0.7159722222222222 | 297.728 |
| 0.7166666666666667 | 289.616 |
| 0.717361111111111 | 281.471 |
| 0.7180555555555556 | 272.106 |
| 0.71875 | 262.666 |
| 0.7194444444444444 | 251.939 |
| 0.720138888888889 | 242.296 |
| 0.7208333333333333 | 232.54 |
| 0.7215277777777778 | 222.665 |
| 0.7222222222222222 | 212.664 |
| 0.7229166666666668 | 203.807 |
| 0.7236111111111111 | 193.561 |
| 0.7243055555555555 | 184.488 |
| 0.725 | 176.631 |
| 0.7256944444444445 | 167.374 |
| 0.7263888888888889 | 159.364 |
| 0.7270833333333333 | 151.286 |
| 0.7277777777777777 | 143.144 |
| 0.7284722222222223 | 136.314 |
| 0.7291666666666666 | 128.065 |
| 0.7298611111111111 | 121.152 |
| 0.7305555555555556 | 114.207 |
| 0.7312500000000001 | 107.232 |
| 0.7319444444444444 | 100.233 |
| 0.7326388888888888 | 93.212 |
| 0.7333333333333334 | 86.175 |
| 0.7340277777777778 | 80.536 |
| 0.7347222222222222 | 73.481 |
| 0.7354166666666666 | 67.835 |
| 0.7361111111111112 | 62.189 |
| 0.7368055555555556 | 56.548 |
| 0.7374999999999999 | 52.322 |
| 0.7381944444444444 | 48.1 |
| 0.7388888888888889 | 43.886 |
| 0.7395833333333334 | 39.68 |
| 0.7402777777777777 | 36.881 |
| 0.7409722222222223 | 34.086 |
| 0.7416666666666667 | 31.297 |
| 0.7423611111111111 | 28.514 |
| 0.7430555555555555 | 25.736 |
| 0.74375 | 22.965 |
| 0.7444444444444445 | 20.201 |
| 0.7451388888888889 | 18.822 |
| 0.7458333333333332 | 16.069 |
| 0.7465277777777778 | 14.696 |
| 0.7472222222222222 | 11.956 |
| 0.7479166666666667 | 10.589 |
| 0.748611111111111 | 9.225 |
| 0.7493055555555556 | 7.862 |
| 0.75 | 6.503 |
| 0.7506944444444444 | 5.146 |
| 0.751388888888889 | 3.791 |
| 0.7520833333333333 | 3.791 |
| 0.7527777777777778 | 2.439 |
| 0.7534722222222222 | 2.439 |
| 0.7541666666666668 | 1.09 |
| 0.7548611111111111 | 1.09 |
| 0.7555555555555555 | 1.09 |
| 0.75625 | -0.256 |
| 0.7569444444444445 | -0.256 |
| 0.7576388888888889 | -0.256 |
| 0.7583333333333333 | -0.256 |
| 0.7590277777777777 | -0.256 |
| 0.7597222222222223 | -0.256 |
| 0.7604166666666666 | -0.256 |
| 0.7611111111111111 | -0.256 |
| 0.7618055555555556 | -0.256 |
| 0.7625000000000001 | -0.256 |
| 0.7631944444444444 | -0.256 |
| 0.7638888888888888 | -0.256 |
| 0.7645833333333334 | -0.256 |
| 0.7652777777777778 | -0.256 |
| 0.7659722222222222 | -0.256 |
| 0.7666666666666666 | -0.256 |
| 0.7673611111111112 | -0.256 |
| 0.7680555555555556 | -0.256 |
| 0.7687499999999999 | -0.256 |
| 0.7694444444444444 | -0.256 |
| 0.7701388888888889 | -0.256 |
| 0.7708333333333334 | -0.256 |
| 0.7715277777777777 | -0.256 |
| 0.7722222222222223 | -0.256 |
| 0.7729166666666667 | -0.256 |
| 0.7736111111111111 | -0.256 |
| 0.7743055555555555 | -0.256 |
| 0.775 | -0.256 |
| 0.7756944444444445 | -0.256 |
| 0.7763888888888889 | -0.256 |
| 0.7770833333333332 | -0.256 |
| 0.7777777777777778 | -0.256 |
| 0.7784722222222222 | -0.256 |
| 0.7791666666666667 | -0.256 |
| 0.779861111111111 | -0.256 |
| 0.7805555555555556 | -0.256 |
| 0.78125 | -0.256 |
| 0.7819444444444444 | -0.256 |
| 0.782638888888889 | -0.256 |
| 0.7833333333333333 | -0.256 |
| 0.7840277777777778 | -0.256 |
| 0.7847222222222222 | -0.256 |
| 0.7854166666666668 | -0.256 |
| 0.7861111111111111 | -0.256 |
| 0.7868055555555555 | -0.256 |
| 0.7875 | -0.256 |
| 0.7881944444444445 | -0.256 |
| 0.7888888888888889 | -0.256 |
| 0.7895833333333333 | -0.256 |
| 0.7902777777777777 | -0.256 |
| 0.7909722222222223 | -0.256 |
| 0.7916666666666666 | -0.256 |
| 0.7923611111111111 | -0.256 |
| 0.7930555555555556 | -0.256 |
| 0.7937500000000001 | -0.256 |
| 0.7944444444444444 | -0.256 |
| 0.7951388888888888 | -0.256 |
| 0.7958333333333334 | -0.256 |
| 0.7965277777777778 | -0.256 |
| 0.7972222222222222 | -0.256 |
| 0.7979166666666666 | -0.256 |
| 0.7986111111111112 | -0.256 |
| 0.7993055555555556 | -0.256 |
| 0.7999999999999999 | -0.256 |
| 0.8006944444444444 | -0.256 |
| 0.8013888888888889 | -0.256 |
| 0.8020833333333334 | -0.256 |
| 0.8027777777777777 | -0.256 |
| 0.8034722222222223 | -0.256 |
| 0.8041666666666667 | -0.256 |
| 0.8048611111111111 | -0.256 |
| 0.8055555555555555 | -0.256 |
| 0.80625 | -0.256 |
| 0.8069444444444445 | -0.256 |
| 0.8076388888888889 | -0.256 |
| 0.8083333333333332 | -0.256 |
| 0.8090277777777778 | -0.256 |
| 0.8097222222222222 | -0.256 |
| 0.8104166666666667 | -0.256 |
| 0.811111111111111 | -0.256 |
| 0.8118055555555556 | -0.256 |
| 0.8125 | -0.256 |
| 0.8131944444444444 | -0.256 |
| 0.813888888888889 | -0.256 |
| 0.8145833333333333 | -0.256 |
| 0.8152777777777778 | -0.256 |
| 0.8159722222222222 | -0.256 |
| 0.8166666666666668 | -0.256 |
| 0.8173611111111111 | -0.256 |
| 0.8180555555555555 | -0.256 |
| 0.81875 | -0.256 |
| 0.8194444444444445 | -0.256 |
| 0.8201388888888889 | -0.256 |
| 0.8208333333333333 | -0.256 |
| 0.8215277777777777 | -0.256 |
| 0.8222222222222223 | -0.256 |
| 0.8229166666666666 | -0.256 |
| 0.8236111111111111 | -0.256 |
| 0.8243055555555556 | -0.256 |
| 0.8250000000000001 | -0.256 |
| 0.8256944444444444 | -0.256 |
| 0.8263888888888888 | -0.256 |
| 0.8270833333333334 | -0.256 |
| 0.8277777777777778 | -0.256 |
| 0.8284722222222222 | -0.256 |
| 0.8291666666666666 | -0.256 |
| 0.8298611111111112 | -0.256 |
| 0.8305555555555556 | -0.256 |
| 0.8312499999999999 | -0.256 |
| 0.8319444444444444 | -0.256 |
| 0.8326388888888889 | -0.256 |
| 0.8333333333333334 | -0.256 |
| 0.8340277777777777 | -0.256 |
| 0.8347222222222223 | -0.256 |
| 0.8354166666666667 | -0.256 |
| 0.8361111111111111 | -0.256 |
| 0.8368055555555555 | -0.256 |
| 0.8375 | -0.256 |
| 0.8381944444444445 | -0.256 |
| 0.8388888888888889 | -0.256 |
| 0.8395833333333332 | -0.256 |
| 0.8402777777777778 | -0.256 |
| 0.8409722222222222 | -0.256 |
| 0.8416666666666667 | -0.256 |
| 0.842361111111111 | -0.256 |
| 0.8430555555555556 | -0.256 |
| 0.84375 | -0.256 |
| 0.8444444444444444 | -0.256 |
| 0.845138888888889 | -0.256 |
| 0.8458333333333333 | -0.256 |
| 0.8465277777777778 | -0.256 |
| 0.8472222222222222 | -0.256 |
| 0.8479166666666668 | -0.256 |
| 0.8486111111111111 | -0.256 |
| 0.8493055555555555 | -0.256 |
| 0.85 | -0.256 |
| 0.8506944444444445 | -0.256 |
| 0.8513888888888889 | -0.256 |
| 0.8520833333333333 | -0.256 |
| 0.8527777777777777 | -0.256 |
| 0.8534722222222223 | -0.256 |
| 0.8541666666666666 | -0.256 |
| 0.8548611111111111 | -0.256 |
| 0.8555555555555556 | -0.256 |
| 0.8562500000000001 | -0.256 |
| 0.8569444444444444 | -0.256 |
| 0.8576388888888888 | -0.256 |
| 0.8583333333333334 | -0.256 |
| 0.8590277777777778 | -0.256 |
| 0.8597222222222222 | -0.256 |
| 0.8604166666666666 | -0.256 |
| 0.8611111111111112 | -0.256 |
| 0.8618055555555556 | -0.256 |
| 0.8624999999999999 | -0.256 |
| 0.8631944444444444 | -0.256 |
| 0.8638888888888889 | -0.256 |
| 0.8645833333333334 | -0.256 |
| 0.8652777777777777 | -0.256 |
| 0.8659722222222223 | -0.256 |
| 0.8666666666666667 | -0.256 |
| 0.8673611111111111 | -0.256 |
| 0.8680555555555555 | -0.256 |
| 0.86875 | -0.256 |
| 0.8694444444444445 | -0.256 |
| 0.8701388888888889 | -0.256 |
| 0.8708333333333332 | -0.256 |
| 0.8715277777777778 | -0.256 |
| 0.8722222222222222 | -0.256 |
| 0.8729166666666667 | -0.256 |
| 0.873611111111111 | -0.256 |
| 0.8743055555555556 | -0.256 |
| 0.875 | -0.256 |
| 0.8756944444444444 | -0.256 |
| 0.876388888888889 | -0.256 |
| 0.8770833333333333 | -0.256 |
| 0.8777777777777778 | -0.256 |
| 0.8784722222222222 | -0.256 |
| 0.8791666666666668 | -0.256 |
| 0.8798611111111111 | -0.256 |
| 0.8805555555555555 | -0.256 |
| 0.88125 | -0.256 |
| 0.8819444444444445 | -0.256 |
| 0.8826388888888889 | -0.256 |
| 0.8833333333333333 | -0.256 |
| 0.8840277777777777 | -0.256 |
| 0.8847222222222223 | -0.256 |
| 0.8854166666666666 | -0.256 |
| 0.8861111111111111 | -0.256 |
| 0.8868055555555556 | -0.256 |
| 0.8875000000000001 | -0.256 |
| 0.8881944444444444 | -0.256 |
| 0.8888888888888888 | -0.256 |
| 0.8895833333333334 | -0.256 |
| 0.8902777777777778 | -0.256 |
| 0.8909722222222222 | -0.256 |
| 0.8916666666666666 | -0.256 |
| 0.8923611111111112 | -0.256 |
| 0.8930555555555556 | -0.256 |
| 0.8937499999999999 | -0.256 |
| 0.8944444444444444 | -0.256 |
| 0.8951388888888889 | -0.256 |
| 0.8958333333333334 | -0.256 |
| 0.8965277777777777 | -0.256 |
| 0.8972222222222223 | -0.256 |
| 0.8979166666666667 | -0.256 |
| 0.8986111111111111 | -0.256 |
| 0.8993055555555555 | -0.256 |
| 0.9 | -0.256 |
| 0.9006944444444445 | -0.256 |
| 0.9013888888888889 | -0.256 |
| 0.9020833333333332 | -0.256 |
| 0.9027777777777778 | -0.256 |
| 0.9034722222222222 | -0.256 |
| 0.9041666666666667 | -0.256 |
| 0.904861111111111 | -0.256 |
| 0.9055555555555556 | -0.256 |
| 0.90625 | -0.256 |
| 0.9069444444444444 | -0.256 |
| 0.907638888888889 | -0.256 |
| 0.9083333333333333 | -0.256 |
| 0.9090277777777778 | -0.256 |
| 0.9097222222222222 | -0.256 |
| 0.9104166666666668 | -0.256 |
| 0.9111111111111111 | -0.256 |
| 0.9118055555555555 | -0.256 |
| 0.9125 | -0.256 |
| 0.9131944444444445 | -0.256 |
| 0.9138888888888889 | -0.256 |
| 0.9145833333333333 | -0.256 |
| 0.9152777777777777 | -0.256 |
| 0.9159722222222223 | -0.256 |
| 0.9166666666666666 | -0.256 |
| 0.9173611111111111 | -0.256 |
| 0.9180555555555556 | -0.256 |
| 0.9187500000000001 | -0.256 |
| 0.9194444444444444 | -0.256 |
| 0.9201388888888888 | -0.256 |
| 0.9208333333333334 | -0.256 |
| 0.9215277777777778 | -0.256 |
| 0.9222222222222222 | -0.256 |
| 0.9229166666666666 | -0.256 |
| 0.9236111111111112 | -0.256 |
| 0.9243055555555556 | -0.256 |
| 0.9249999999999999 | -0.256 |
| 0.9256944444444444 | -0.256 |
| 0.9263888888888889 | -0.256 |
| 0.9270833333333334 | -0.256 |
| 0.9277777777777777 | -0.256 |
| 0.9284722222222223 | -0.256 |
| 0.9291666666666667 | -0.256 |
| 0.9298611111111111 | -0.256 |
| 0.9305555555555555 | -0.256 |
| 0.93125 | -0.256 |
| 0.9319444444444445 | -0.256 |
| 0.9326388888888889 | -0.256 |
| 0.9333333333333332 | -0.256 |
| 0.9340277777777778 | -0.256 |
| 0.9347222222222222 | -0.256 |
| 0.9354166666666667 | -0.256 |
| 0.936111111111111 | -0.256 |
| 0.9368055555555556 | -0.256 |
| 0.9375 | -0.256 |
| 0.9381944444444444 | -0.256 |
| 0.938888888888889 | -0.256 |
| 0.9395833333333333 | -0.256 |
| 0.9402777777777778 | -0.256 |
| 0.9409722222222222 | -0.256 |
| 0.9416666666666668 | -0.256 |
| 0.9423611111111111 | -0.256 |
| 0.9430555555555555 | -0.256 |
| 0.94375 | -0.256 |
| 0.9444444444444445 | -0.256 |
| 0.9451388888888889 | -0.256 |
| 0.9458333333333333 | -0.256 |
| 0.9465277777777777 | -0.256 |
| 0.9472222222222223 | -0.256 |
| 0.9479166666666666 | -0.256 |
| 0.9486111111111111 | -0.256 |
| 0.9493055555555556 | -0.256 |
| 0.9500000000000001 | -0.256 |
| 0.9506944444444444 | -0.256 |
| 0.9513888888888888 | -0.256 |
| 0.9520833333333334 | -0.256 |
| 0.9527777777777778 | -0.256 |
| 0.9534722222222222 | -0.256 |
| 0.9541666666666666 | -0.256 |
| 0.9548611111111112 | -0.256 |
| 0.9555555555555556 | -0.256 |
| 0.9562499999999999 | -0.256 |
| 0.9569444444444444 | -0.256 |
| 0.9576388888888889 | -0.256 |
| 0.9583333333333334 | -0.256 |
| 0.9590277777777777 | -0.256 |
| 0.9597222222222223 | -0.256 |
| 0.9604166666666667 | -0.256 |
| 0.9611111111111111 | -0.256 |
| 0.9618055555555555 | -0.256 |
| 0.9625 | -0.256 |
| 0.9631944444444445 | -0.256 |
| 0.9638888888888889 | -0.256 |
| 0.9645833333333332 | -0.256 |
| 0.9652777777777778 | -0.256 |
| 0.9659722222222222 | -0.256 |
| 0.9666666666666667 | -0.256 |
| 0.967361111111111 | -0.256 |
| 0.9680555555555556 | -0.256 |
| 0.96875 | -0.256 |
| 0.9694444444444444 | -0.256 |
| 0.970138888888889 | -0.256 |
| 0.9708333333333333 | -0.256 |
| 0.9715277777777778 | -0.256 |
| 0.9722222222222222 | -0.256 |
| 0.9729166666666668 | -0.256 |
| 0.9736111111111111 | -0.256 |
| 0.9743055555555555 | -0.256 |
| 0.975 | -0.256 |
| 0.9756944444444445 | -0.256 |
| 0.9763888888888889 | -0.256 |
| 0.9770833333333333 | -0.256 |
| 0.9777777777777777 | -0.256 |
| 0.9784722222222223 | -0.256 |
| 0.9791666666666666 | -0.256 |
| 0.9798611111111111 | -0.256 |
| 0.9805555555555556 | -0.256 |
| 0.9812500000000001 | -0.256 |
| 0.9819444444444444 | -0.256 |
| 0.9826388888888888 | -0.256 |
| 0.9833333333333334 | -0.256 |
| 0.9840277777777778 | -0.256 |
| 0.9847222222222222 | -0.256 |
| 0.9854166666666666 | -0.256 |
| 0.9861111111111112 | -0.256 |
| 0.9868055555555556 | -0.256 |
| 0.9874999999999999 | -0.256 |
| 0.9881944444444444 | -0.256 |
| 0.9888888888888889 | -0.256 |
| 0.9895833333333334 | -0.256 |
| 0.9902777777777777 | -0.256 |
| 0.9909722222222223 | -0.256 |
| 0.9916666666666667 | -0.256 |
| 0.9923611111111111 | -0.256 |
| 0.9930555555555555 | -0.256 |
| 0.99375 | -0.256 |
| 0.9944444444444445 | -0.256 |
| 0.9951388888888889 | -0.256 |
| 0.9958333333333332 | -0.256 |
| 0.9965277777777778 | -0.256 |
| 0.9972222222222222 | -0.256 |
| 0.9979166666666667 | -0.256 |
| 0.998611111111111 | -0.256 |
| 0.9993055555555556 | 0 |